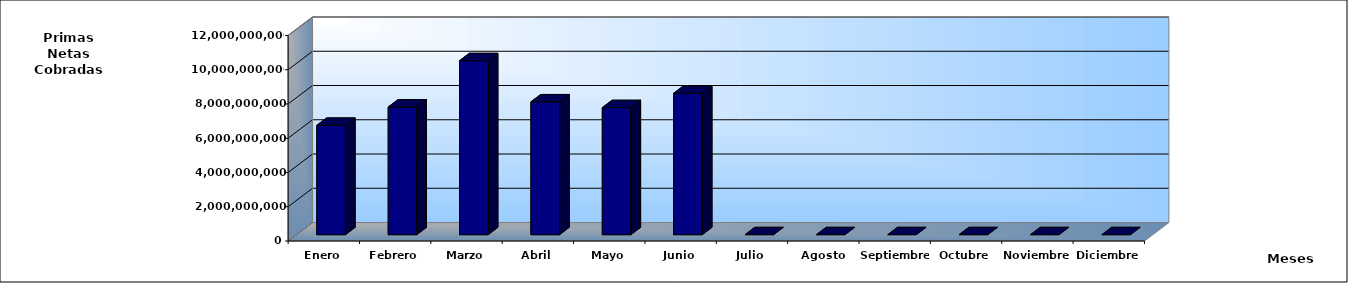
| Category | Series 0 |
|---|---|
| Enero | 6386339260.41 |
| Febrero | 7455778580.88 |
| Marzo | 10161183389.08 |
| Abril | 7756182761.13 |
| Mayo | 7420501428.8 |
| Junio | 8257043153.85 |
| Julio | 0 |
| Agosto | 0 |
| Septiembre | 0 |
| Octubre | 0 |
| Noviembre | 0 |
| Diciembre | 0 |